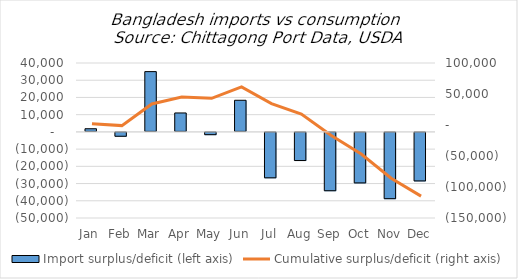
| Category | Import surplus/deficit (left axis) |
|---|---|
| Jan | 1825 |
| Feb | -2825 |
| Mar | 34994 |
| Apr | 10993 |
| May | -1908 |
| Jun | 18355 |
| Jul | -26957 |
| Aug | -16927 |
| Sep | -34462 |
| Oct | -29920 |
| Nov | -39076 |
| Dec | -28763 |